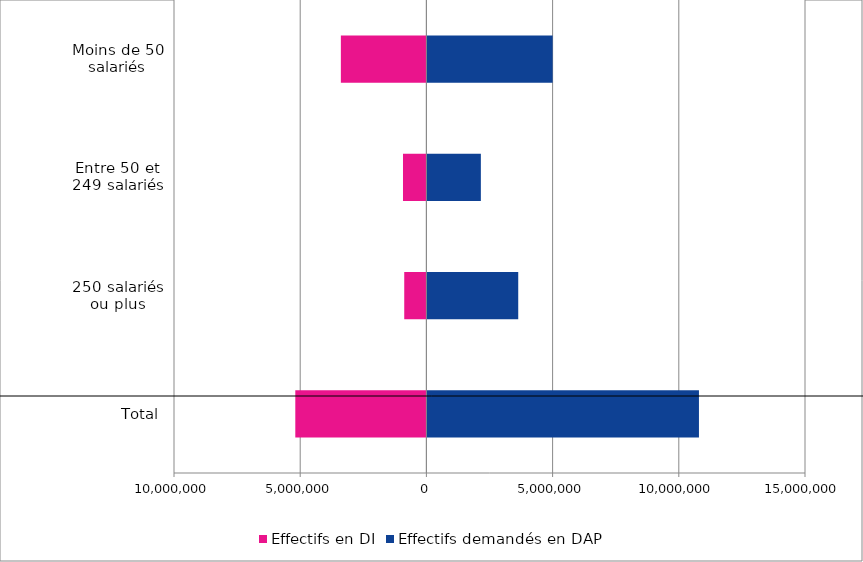
| Category | Effectifs en DI | Effectifs demandés en DAP |
|---|---|---|
| Total | -5193998 | 10798599 |
| 250 salariés ou plus | -877905 | 3638598 |
| Entre 50 et 249 salariés | -927277 | 2157771 |
| Moins de 50 salariés | -3388816 | 5002230 |